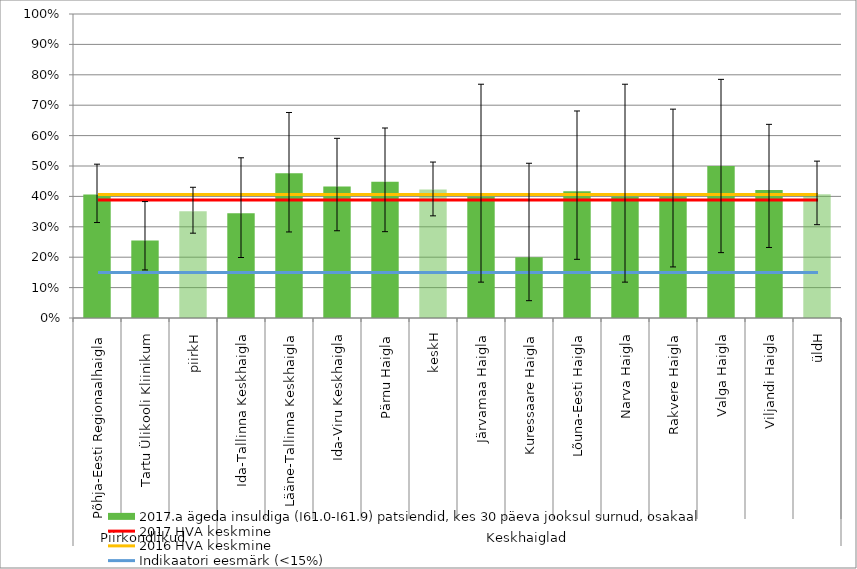
| Category | 2017.a ägeda insuldiga (I61.0-I61.9) patsiendid, kes 30 päeva jooksul surnud, osakaal |
|---|---|
| 0 | 0.406 |
| 1 | 0.255 |
| 2 | 0.351 |
| 3 | 0.345 |
| 4 | 0.476 |
| 5 | 0.432 |
| 6 | 0.448 |
| 7 | 0.422 |
| 8 | 0.4 |
| 9 | 0.2 |
| 10 | 0.417 |
| 11 | 0.4 |
| 12 | 0.4 |
| 13 | 0.5 |
| 14 | 0.421 |
| 15 | 0.407 |